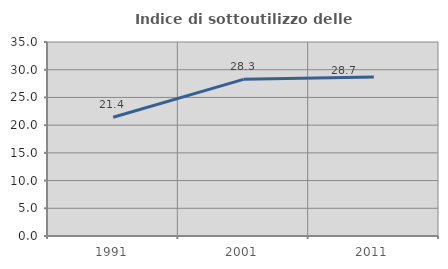
| Category | Indice di sottoutilizzo delle abitazioni  |
|---|---|
| 1991.0 | 21.415 |
| 2001.0 | 28.264 |
| 2011.0 | 28.67 |